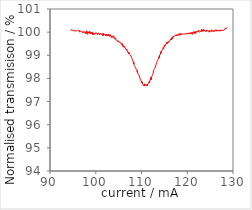
| Category | 6250ppm |
|---|---|
| 94.512 | 100.059 |
| 94.544 | 100.059 |
| 94.576 | 100.059 |
| 94.608 | 100.078 |
| 94.64 | 100.078 |
| 94.672 | 100.078 |
| 94.704 | 100.118 |
| 94.736 | 100.098 |
| 94.768 | 100.078 |
| 94.8 | 100.078 |
| 94.832 | 100.078 |
| 94.864 | 100.078 |
| 94.896 | 100.117 |
| 94.928 | 100.098 |
| 94.96 | 100.078 |
| 94.992 | 100.078 |
| 95.024 | 100.058 |
| 95.056 | 100.059 |
| 95.088 | 100.098 |
| 95.12 | 100.097 |
| 95.152 | 100.039 |
| 95.184 | 100.078 |
| 95.216 | 100.058 |
| 95.248 | 100.058 |
| 95.28 | 100.019 |
| 95.312 | 100.078 |
| 95.344 | 100.097 |
| 95.376 | 100.058 |
| 95.408 | 100.058 |
| 95.44 | 100.058 |
| 95.472 | 100.078 |
| 95.504 | 100.078 |
| 95.536 | 100.058 |
| 95.568 | 100.039 |
| 95.6 | 100.039 |
| 95.632 | 100.039 |
| 95.664 | 100.078 |
| 95.696 | 100.058 |
| 95.728 | 100.058 |
| 95.76 | 100 |
| 95.792 | 100.058 |
| 95.824 | 100.039 |
| 95.856 | 100.039 |
| 95.888 | 100.077 |
| 95.92 | 100.077 |
| 95.952 | 100.097 |
| 95.984 | 100.097 |
| 96.016 | 100.077 |
| 96.048 | 100.039 |
| 96.08 | 100.058 |
| 96.112 | 100.058 |
| 96.144 | 100.039 |
| 96.176 | 100.039 |
| 96.208 | 100.058 |
| 96.24 | 100.058 |
| 96.272 | 100.077 |
| 96.304 | 100.058 |
| 96.336 | 100.077 |
| 96.368 | 100.077 |
| 96.4 | 100.038 |
| 96.432 | 100.077 |
| 96.464 | 100.077 |
| 96.496 | 100 |
| 96.528 | 100.038 |
| 96.56 | 100.019 |
| 96.592 | 100.019 |
| 96.624 | 100.038 |
| 96.656 | 100.038 |
| 96.688 | 100.058 |
| 96.72 | 100.019 |
| 96.752 | 100.038 |
| 96.784 | 100.038 |
| 96.816 | 100.038 |
| 96.848 | 100.057 |
| 96.88 | 100.019 |
| 96.912 | 100.019 |
| 96.944 | 100 |
| 96.976 | 100.057 |
| 97.008 | 100.019 |
| 97.03999999999999 | 100 |
| 97.072 | 100.019 |
| 97.104 | 100.019 |
| 97.136 | 99.981 |
| 97.168 | 100.019 |
| 97.2 | 100.038 |
| 97.232 | 100.038 |
| 97.264 | 100 |
| 97.296 | 100.019 |
| 97.328 | 100 |
| 97.36 | 100 |
| 97.392 | 100 |
| 97.424 | 99.962 |
| 97.456 | 100 |
| 97.488 | 99.962 |
| 97.52 | 100.019 |
| 97.55199999999999 | 100 |
| 97.584 | 100.019 |
| 97.616 | 100.019 |
| 97.648 | 100 |
| 97.68 | 100 |
| 97.712 | 100.019 |
| 97.744 | 99.981 |
| 97.776 | 99.962 |
| 97.808 | 99.924 |
| 97.84 | 99.962 |
| 97.872 | 100 |
| 97.904 | 100 |
| 97.936 | 99.981 |
| 97.968 | 100 |
| 98.0 | 100.057 |
| 98.032 | 99.981 |
| 98.064 | 99.981 |
| 98.096 | 99.943 |
| 98.128 | 99.981 |
| 98.16 | 99.962 |
| 98.19200000000001 | 100 |
| 98.224 | 99.906 |
| 98.256 | 99.943 |
| 98.288 | 100.019 |
| 98.32 | 100 |
| 98.352 | 100 |
| 98.384 | 99.962 |
| 98.416 | 100 |
| 98.44800000000001 | 99.925 |
| 98.48 | 99.981 |
| 98.512 | 100 |
| 98.544 | 99.963 |
| 98.576 | 99.944 |
| 98.608 | 99.962 |
| 98.64 | 99.962 |
| 98.672 | 100.038 |
| 98.704 | 99.981 |
| 98.736 | 99.981 |
| 98.768 | 99.981 |
| 98.8 | 100.019 |
| 98.832 | 99.925 |
| 98.864 | 99.981 |
| 98.896 | 99.925 |
| 98.928 | 99.963 |
| 98.96000000000001 | 99.944 |
| 98.992 | 99.944 |
| 99.024 | 100 |
| 99.056 | 99.981 |
| 99.088 | 99.981 |
| 99.12 | 99.963 |
| 99.152 | 99.963 |
| 99.184 | 99.944 |
| 99.216 | 99.944 |
| 99.248 | 99.944 |
| 99.28 | 99.888 |
| 99.312 | 99.981 |
| 99.344 | 99.963 |
| 99.376 | 99.944 |
| 99.408 | 99.944 |
| 99.44 | 99.907 |
| 99.47200000000001 | 99.963 |
| 99.504 | 99.963 |
| 99.536 | 99.944 |
| 99.568 | 99.963 |
| 99.6 | 99.963 |
| 99.632 | 99.907 |
| 99.664 | 99.926 |
| 99.696 | 99.963 |
| 99.728 | 99.944 |
| 99.76 | 99.926 |
| 99.792 | 99.907 |
| 99.824 | 99.944 |
| 99.856 | 99.907 |
| 99.888 | 99.963 |
| 99.92 | 99.981 |
| 99.952 | 99.945 |
| 99.984 | 99.926 |
| 100.016 | 99.944 |
| 100.048 | 99.926 |
| 100.08 | 99.944 |
| 100.112 | 99.963 |
| 100.144 | 99.944 |
| 100.176 | 99.945 |
| 100.208 | 99.963 |
| 100.24 | 99.982 |
| 100.27199999999999 | 99.963 |
| 100.304 | 99.963 |
| 100.336 | 99.945 |
| 100.368 | 99.945 |
| 100.4 | 99.889 |
| 100.432 | 99.945 |
| 100.464 | 99.945 |
| 100.496 | 99.908 |
| 100.52799999999999 | 99.926 |
| 100.56 | 99.926 |
| 100.592 | 99.926 |
| 100.624 | 99.908 |
| 100.656 | 99.963 |
| 100.688 | 99.926 |
| 100.72 | 99.908 |
| 100.752 | 99.945 |
| 100.784 | 99.871 |
| 100.816 | 99.926 |
| 100.848 | 99.89 |
| 100.88 | 99.908 |
| 100.912 | 99.908 |
| 100.944 | 99.908 |
| 100.976 | 99.908 |
| 101.008 | 99.927 |
| 101.04 | 99.908 |
| 101.072 | 99.963 |
| 101.104 | 99.908 |
| 101.136 | 99.945 |
| 101.168 | 99.927 |
| 101.2 | 99.908 |
| 101.232 | 99.945 |
| 101.264 | 99.945 |
| 101.29599999999999 | 99.909 |
| 101.328 | 99.909 |
| 101.36 | 99.909 |
| 101.392 | 99.89 |
| 101.424 | 99.891 |
| 101.456 | 99.872 |
| 101.488 | 99.854 |
| 101.52 | 99.927 |
| 101.55199999999999 | 99.891 |
| 101.584 | 99.891 |
| 101.616 | 99.909 |
| 101.648 | 99.854 |
| 101.68 | 99.872 |
| 101.712 | 99.945 |
| 101.744 | 99.891 |
| 101.776 | 99.891 |
| 101.80799999999999 | 99.891 |
| 101.84 | 99.891 |
| 101.872 | 99.891 |
| 101.904 | 99.891 |
| 101.936 | 99.891 |
| 101.968 | 99.909 |
| 102.0 | 99.891 |
| 102.032 | 99.909 |
| 102.064 | 99.891 |
| 102.096 | 99.891 |
| 102.128 | 99.909 |
| 102.16 | 99.873 |
| 102.19200000000001 | 99.837 |
| 102.224 | 99.909 |
| 102.256 | 99.873 |
| 102.288 | 99.909 |
| 102.32 | 99.891 |
| 102.352 | 99.855 |
| 102.384 | 99.819 |
| 102.416 | 99.909 |
| 102.448 | 99.855 |
| 102.48 | 99.873 |
| 102.512 | 99.855 |
| 102.544 | 99.855 |
| 102.576 | 99.855 |
| 102.608 | 99.819 |
| 102.64 | 99.874 |
| 102.672 | 99.856 |
| 102.70400000000001 | 99.856 |
| 102.736 | 99.838 |
| 102.768 | 99.91 |
| 102.8 | 99.856 |
| 102.832 | 99.892 |
| 102.864 | 99.874 |
| 102.896 | 99.874 |
| 102.928 | 99.82 |
| 102.96000000000001 | 99.892 |
| 102.992 | 99.82 |
| 103.024 | 99.874 |
| 103.056 | 99.82 |
| 103.088 | 99.856 |
| 103.12 | 99.892 |
| 103.152 | 99.838 |
| 103.184 | 99.838 |
| 103.21600000000001 | 99.802 |
| 103.248 | 99.874 |
| 103.28 | 99.856 |
| 103.312 | 99.838 |
| 103.344 | 99.839 |
| 103.376 | 99.839 |
| 103.408 | 99.839 |
| 103.44 | 99.857 |
| 103.472 | 99.857 |
| 103.504 | 99.767 |
| 103.536 | 99.821 |
| 103.568 | 99.803 |
| 103.6 | 99.821 |
| 103.632 | 99.786 |
| 103.664 | 99.786 |
| 103.696 | 99.786 |
| 103.728 | 99.768 |
| 103.75999999999999 | 99.821 |
| 103.792 | 99.786 |
| 103.824 | 99.821 |
| 103.856 | 99.786 |
| 103.888 | 99.804 |
| 103.92 | 99.804 |
| 103.952 | 99.822 |
| 103.98400000000001 | 99.84 |
| 104.016 | 99.751 |
| 104.048 | 99.751 |
| 104.08 | 99.768 |
| 104.112 | 99.751 |
| 104.144 | 99.733 |
| 104.176 | 99.769 |
| 104.208 | 99.733 |
| 104.24 | 99.698 |
| 104.272 | 99.698 |
| 104.304 | 99.751 |
| 104.336 | 99.734 |
| 104.368 | 99.698 |
| 104.4 | 99.698 |
| 104.432 | 99.716 |
| 104.464 | 99.716 |
| 104.496 | 99.716 |
| 104.528 | 99.646 |
| 104.56 | 99.646 |
| 104.592 | 99.663 |
| 104.624 | 99.628 |
| 104.656 | 99.664 |
| 104.688 | 99.628 |
| 104.72 | 99.611 |
| 104.752 | 99.629 |
| 104.78399999999999 | 99.629 |
| 104.816 | 99.611 |
| 104.848 | 99.576 |
| 104.88 | 99.594 |
| 104.912 | 99.611 |
| 104.944 | 99.629 |
| 104.976 | 99.594 |
| 105.008 | 99.647 |
| 105.03999999999999 | 99.612 |
| 105.072 | 99.612 |
| 105.104 | 99.594 |
| 105.136 | 99.595 |
| 105.168 | 99.559 |
| 105.2 | 99.595 |
| 105.232 | 99.56 |
| 105.264 | 99.577 |
| 105.296 | 99.542 |
| 105.328 | 99.595 |
| 105.36 | 99.543 |
| 105.392 | 99.56 |
| 105.424 | 99.525 |
| 105.456 | 99.543 |
| 105.488 | 99.508 |
| 105.52 | 99.526 |
| 105.55199999999999 | 99.508 |
| 105.584 | 99.526 |
| 105.616 | 99.473 |
| 105.648 | 99.544 |
| 105.68 | 99.491 |
| 105.712 | 99.457 |
| 105.744 | 99.509 |
| 105.776 | 99.509 |
| 105.80799999999999 | 99.492 |
| 105.84 | 99.457 |
| 105.872 | 99.388 |
| 105.904 | 99.423 |
| 105.936 | 99.44 |
| 105.968 | 99.423 |
| 106.0 | 99.406 |
| 106.032 | 99.406 |
| 106.064 | 99.388 |
| 106.096 | 99.371 |
| 106.128 | 99.406 |
| 106.16 | 99.371 |
| 106.19200000000001 | 99.337 |
| 106.224 | 99.337 |
| 106.256 | 99.337 |
| 106.288 | 99.389 |
| 106.32 | 99.355 |
| 106.352 | 99.355 |
| 106.384 | 99.355 |
| 106.416 | 99.321 |
| 106.44800000000001 | 99.338 |
| 106.48 | 99.356 |
| 106.512 | 99.339 |
| 106.544 | 99.304 |
| 106.576 | 99.287 |
| 106.608 | 99.27 |
| 106.64 | 99.304 |
| 106.672 | 99.27 |
| 106.70400000000001 | 99.218 |
| 106.736 | 99.253 |
| 106.768 | 99.271 |
| 106.8 | 99.236 |
| 106.832 | 99.236 |
| 106.864 | 99.236 |
| 106.896 | 99.202 |
| 106.928 | 99.22 |
| 106.96000000000001 | 99.168 |
| 106.992 | 99.168 |
| 107.024 | 99.168 |
| 107.056 | 99.117 |
| 107.088 | 99.117 |
| 107.12 | 99.117 |
| 107.152 | 99.135 |
| 107.184 | 99.066 |
| 107.21600000000001 | 99.135 |
| 107.248 | 99.118 |
| 107.28 | 99.136 |
| 107.312 | 99.067 |
| 107.344 | 99.05 |
| 107.376 | 99.067 |
| 107.408 | 99.05 |
| 107.44 | 99.051 |
| 107.47200000000001 | 99.051 |
| 107.50399999999999 | 99.017 |
| 107.536 | 99.017 |
| 107.568 | 99.017 |
| 107.6 | 98.983 |
| 107.632 | 99 |
| 107.664 | 99.001 |
| 107.696 | 99.018 |
| 107.728 | 98.967 |
| 107.76 | 98.967 |
| 107.792 | 98.933 |
| 107.824 | 98.899 |
| 107.856 | 98.899 |
| 107.888 | 98.865 |
| 107.92 | 98.883 |
| 107.952 | 98.849 |
| 107.98400000000001 | 98.832 |
| 108.016 | 98.815 |
| 108.048 | 98.798 |
| 108.08 | 98.781 |
| 108.112 | 98.782 |
| 108.144 | 98.748 |
| 108.176 | 98.731 |
| 108.208 | 98.765 |
| 108.24000000000001 | 98.697 |
| 108.27199999999999 | 98.646 |
| 108.304 | 98.698 |
| 108.336 | 98.613 |
| 108.368 | 98.631 |
| 108.4 | 98.614 |
| 108.432 | 98.563 |
| 108.464 | 98.563 |
| 108.496 | 98.581 |
| 108.52799999999999 | 98.53 |
| 108.56 | 98.53 |
| 108.592 | 98.514 |
| 108.624 | 98.548 |
| 108.656 | 98.515 |
| 108.688 | 98.463 |
| 108.72 | 98.498 |
| 108.752 | 98.481 |
| 108.78399999999999 | 98.481 |
| 108.816 | 98.414 |
| 108.848 | 98.431 |
| 108.88 | 98.432 |
| 108.912 | 98.432 |
| 108.944 | 98.416 |
| 108.976 | 98.398 |
| 109.008 | 98.382 |
| 109.03999999999999 | 98.365 |
| 109.072 | 98.281 |
| 109.104 | 98.332 |
| 109.136 | 98.282 |
| 109.168 | 98.232 |
| 109.2 | 98.265 |
| 109.232 | 98.266 |
| 109.264 | 98.199 |
| 109.29599999999999 | 98.217 |
| 109.328 | 98.183 |
| 109.36 | 98.166 |
| 109.392 | 98.15 |
| 109.424 | 98.15 |
| 109.456 | 98.134 |
| 109.488 | 98.101 |
| 109.52 | 98.101 |
| 109.55199999999999 | 98.102 |
| 109.584 | 98.052 |
| 109.616 | 98.035 |
| 109.648 | 98.035 |
| 109.68 | 98.036 |
| 109.712 | 97.97 |
| 109.744 | 98.004 |
| 109.776 | 97.97 |
| 109.80799999999999 | 98.004 |
| 109.84 | 97.971 |
| 109.872 | 97.938 |
| 109.904 | 97.905 |
| 109.936 | 97.938 |
| 109.968 | 97.923 |
| 110.0 | 97.873 |
| 110.032 | 97.873 |
| 110.064 | 97.807 |
| 110.096 | 97.857 |
| 110.128 | 97.858 |
| 110.16 | 97.824 |
| 110.19200000000001 | 97.808 |
| 110.224 | 97.776 |
| 110.256 | 97.793 |
| 110.288 | 97.743 |
| 110.32 | 97.728 |
| 110.352 | 97.761 |
| 110.384 | 97.728 |
| 110.416 | 97.729 |
| 110.44800000000001 | 97.763 |
| 110.48 | 97.68 |
| 110.512 | 97.714 |
| 110.544 | 97.681 |
| 110.576 | 97.715 |
| 110.608 | 97.699 |
| 110.64 | 97.766 |
| 110.672 | 97.684 |
| 110.704 | 97.718 |
| 110.73599999999999 | 97.75 |
| 110.768 | 97.735 |
| 110.8 | 97.735 |
| 110.832 | 97.719 |
| 110.864 | 97.72 |
| 110.896 | 97.704 |
| 110.928 | 97.722 |
| 110.96000000000001 | 97.689 |
| 110.992 | 97.69 |
| 111.024 | 97.674 |
| 111.056 | 97.724 |
| 111.088 | 97.708 |
| 111.12 | 97.692 |
| 111.152 | 97.726 |
| 111.184 | 97.677 |
| 111.21600000000001 | 97.744 |
| 111.248 | 97.777 |
| 111.28 | 97.679 |
| 111.312 | 97.762 |
| 111.344 | 97.78 |
| 111.376 | 97.73 |
| 111.408 | 97.748 |
| 111.44 | 97.748 |
| 111.47200000000001 | 97.748 |
| 111.50399999999999 | 97.782 |
| 111.536 | 97.783 |
| 111.568 | 97.8 |
| 111.6 | 97.784 |
| 111.632 | 97.818 |
| 111.664 | 97.819 |
| 111.696 | 97.869 |
| 111.72800000000001 | 97.804 |
| 111.76 | 97.837 |
| 111.792 | 97.855 |
| 111.824 | 97.855 |
| 111.856 | 97.872 |
| 111.888 | 97.89 |
| 111.92 | 97.874 |
| 111.952 | 97.973 |
| 111.984 | 97.958 |
| 112.01599999999999 | 97.958 |
| 112.048 | 98.041 |
| 112.08 | 98.009 |
| 112.112 | 97.944 |
| 112.144 | 98.01 |
| 112.176 | 98.044 |
| 112.208 | 97.995 |
| 112.24000000000001 | 98.045 |
| 112.27199999999999 | 98.095 |
| 112.304 | 98.128 |
| 112.336 | 98.113 |
| 112.368 | 98.13 |
| 112.4 | 98.114 |
| 112.432 | 98.164 |
| 112.464 | 98.181 |
| 112.49600000000001 | 98.197 |
| 112.528 | 98.198 |
| 112.56 | 98.232 |
| 112.592 | 98.265 |
| 112.624 | 98.315 |
| 112.656 | 98.315 |
| 112.688 | 98.332 |
| 112.72 | 98.382 |
| 112.752 | 98.35 |
| 112.78399999999999 | 98.367 |
| 112.816 | 98.384 |
| 112.848 | 98.401 |
| 112.88 | 98.434 |
| 112.912 | 98.451 |
| 112.944 | 98.468 |
| 112.976 | 98.468 |
| 113.00800000000001 | 98.485 |
| 113.03999999999999 | 98.519 |
| 113.072 | 98.535 |
| 113.104 | 98.536 |
| 113.136 | 98.52 |
| 113.168 | 98.569 |
| 113.2 | 98.57 |
| 113.232 | 98.62 |
| 113.264 | 98.653 |
| 113.29599999999999 | 98.653 |
| 113.328 | 98.686 |
| 113.36 | 98.719 |
| 113.392 | 98.671 |
| 113.424 | 98.737 |
| 113.456 | 98.753 |
| 113.488 | 98.754 |
| 113.52 | 98.771 |
| 113.55199999999999 | 98.787 |
| 113.584 | 98.788 |
| 113.616 | 98.788 |
| 113.648 | 98.773 |
| 113.68 | 98.838 |
| 113.712 | 98.822 |
| 113.744 | 98.854 |
| 113.77600000000001 | 98.888 |
| 113.80799999999999 | 98.855 |
| 113.84 | 98.937 |
| 113.872 | 98.954 |
| 113.904 | 98.889 |
| 113.936 | 98.922 |
| 113.96799999999999 | 99.003 |
| 114.0 | 98.988 |
| 114.032 | 99.02 |
| 114.064 | 99.005 |
| 114.096 | 99.038 |
| 114.128 | 99.054 |
| 114.16 | 99.038 |
| 114.19200000000001 | 99.071 |
| 114.224 | 99.152 |
| 114.256 | 99.088 |
| 114.288 | 99.137 |
| 114.32 | 99.153 |
| 114.352 | 99.153 |
| 114.384 | 99.153 |
| 114.416 | 99.17 |
| 114.44800000000001 | 99.219 |
| 114.48 | 99.187 |
| 114.512 | 99.203 |
| 114.544 | 99.22 |
| 114.576 | 99.236 |
| 114.608 | 99.236 |
| 114.64 | 99.237 |
| 114.672 | 99.253 |
| 114.70400000000001 | 99.334 |
| 114.73599999999999 | 99.302 |
| 114.768 | 99.302 |
| 114.8 | 99.351 |
| 114.832 | 99.319 |
| 114.864 | 99.287 |
| 114.896 | 99.352 |
| 114.928 | 99.319 |
| 114.96000000000001 | 99.336 |
| 114.992 | 99.433 |
| 115.024 | 99.401 |
| 115.056 | 99.417 |
| 115.088 | 99.385 |
| 115.12 | 99.45 |
| 115.152 | 99.434 |
| 115.184 | 99.418 |
| 115.216 | 99.467 |
| 115.24799999999999 | 99.467 |
| 115.28 | 99.451 |
| 115.312 | 99.419 |
| 115.344 | 99.467 |
| 115.376 | 99.467 |
| 115.408 | 99.483 |
| 115.44 | 99.5 |
| 115.47200000000001 | 99.516 |
| 115.50399999999999 | 99.548 |
| 115.536 | 99.5 |
| 115.568 | 99.565 |
| 115.6 | 99.501 |
| 115.632 | 99.501 |
| 115.664 | 99.533 |
| 115.696 | 99.549 |
| 115.72800000000001 | 99.565 |
| 115.76 | 99.549 |
| 115.792 | 99.582 |
| 115.824 | 99.55 |
| 115.856 | 99.598 |
| 115.888 | 99.598 |
| 115.92 | 99.55 |
| 115.952 | 99.55 |
| 115.984 | 99.567 |
| 116.01599999999999 | 99.583 |
| 116.048 | 99.583 |
| 116.08 | 99.599 |
| 116.112 | 99.631 |
| 116.144 | 99.631 |
| 116.176 | 99.616 |
| 116.208 | 99.631 |
| 116.24000000000001 | 99.584 |
| 116.272 | 99.663 |
| 116.304 | 99.664 |
| 116.336 | 99.664 |
| 116.368 | 99.664 |
| 116.4 | 99.664 |
| 116.432 | 99.696 |
| 116.464 | 99.712 |
| 116.496 | 99.664 |
| 116.52799999999999 | 99.712 |
| 116.56 | 99.664 |
| 116.592 | 99.696 |
| 116.624 | 99.712 |
| 116.656 | 99.713 |
| 116.688 | 99.729 |
| 116.72 | 99.777 |
| 116.752 | 99.712 |
| 116.78399999999999 | 99.744 |
| 116.816 | 99.728 |
| 116.848 | 99.745 |
| 116.88 | 99.745 |
| 116.912 | 99.809 |
| 116.944 | 99.793 |
| 116.976 | 99.792 |
| 117.00800000000001 | 99.776 |
| 117.04 | 99.809 |
| 117.072 | 99.841 |
| 117.104 | 99.809 |
| 117.136 | 99.825 |
| 117.168 | 99.808 |
| 117.2 | 99.793 |
| 117.232 | 99.825 |
| 117.264 | 99.809 |
| 117.29599999999999 | 99.809 |
| 117.328 | 99.809 |
| 117.36 | 99.841 |
| 117.392 | 99.857 |
| 117.424 | 99.841 |
| 117.456 | 99.857 |
| 117.488 | 99.857 |
| 117.52 | 99.889 |
| 117.55199999999999 | 99.842 |
| 117.584 | 99.874 |
| 117.616 | 99.81 |
| 117.648 | 99.889 |
| 117.68 | 99.904 |
| 117.712 | 99.842 |
| 117.744 | 99.858 |
| 117.776 | 99.857 |
| 117.80799999999999 | 99.857 |
| 117.84 | 99.842 |
| 117.872 | 99.889 |
| 117.904 | 99.857 |
| 117.936 | 99.921 |
| 117.968 | 99.842 |
| 118.0 | 99.873 |
| 118.032 | 99.842 |
| 118.064 | 99.873 |
| 118.096 | 99.889 |
| 118.128 | 99.889 |
| 118.16 | 99.89 |
| 118.19200000000001 | 99.937 |
| 118.224 | 99.889 |
| 118.256 | 99.905 |
| 118.28800000000001 | 99.874 |
| 118.32 | 99.921 |
| 118.352 | 99.905 |
| 118.384 | 99.89 |
| 118.416 | 99.906 |
| 118.44800000000001 | 99.921 |
| 118.47999999999999 | 99.921 |
| 118.512 | 99.874 |
| 118.544 | 99.905 |
| 118.576 | 99.937 |
| 118.608 | 99.953 |
| 118.64 | 99.921 |
| 118.672 | 99.89 |
| 118.70400000000001 | 99.89 |
| 118.736 | 99.905 |
| 118.768 | 99.922 |
| 118.8 | 99.921 |
| 118.832 | 99.89 |
| 118.864 | 99.874 |
| 118.896 | 99.922 |
| 118.928 | 99.938 |
| 118.96000000000001 | 99.953 |
| 118.992 | 99.905 |
| 119.024 | 99.905 |
| 119.056 | 99.921 |
| 119.088 | 99.906 |
| 119.12 | 99.922 |
| 119.152 | 99.938 |
| 119.184 | 99.907 |
| 119.21600000000001 | 99.953 |
| 119.24799999999999 | 99.921 |
| 119.28 | 99.921 |
| 119.312 | 99.938 |
| 119.344 | 99.907 |
| 119.376 | 99.938 |
| 119.408 | 99.938 |
| 119.44 | 99.937 |
| 119.47200000000001 | 99.937 |
| 119.504 | 99.938 |
| 119.536 | 99.907 |
| 119.568 | 99.938 |
| 119.6 | 99.953 |
| 119.632 | 99.921 |
| 119.664 | 99.921 |
| 119.696 | 99.952 |
| 119.728 | 99.937 |
| 119.75999999999999 | 99.938 |
| 119.792 | 99.953 |
| 119.824 | 99.954 |
| 119.856 | 99.938 |
| 119.888 | 99.922 |
| 119.92 | 99.906 |
| 119.952 | 99.954 |
| 119.98400000000001 | 99.954 |
| 120.01599999999999 | 99.938 |
| 120.048 | 99.969 |
| 120.08 | 99.969 |
| 120.112 | 99.922 |
| 120.144 | 99.969 |
| 120.176 | 99.923 |
| 120.208 | 99.938 |
| 120.24000000000001 | 99.969 |
| 120.272 | 99.953 |
| 120.304 | 99.937 |
| 120.336 | 99.954 |
| 120.368 | 99.985 |
| 120.4 | 99.938 |
| 120.432 | 99.954 |
| 120.464 | 99.922 |
| 120.496 | 99.922 |
| 120.52799999999999 | 99.923 |
| 120.56 | 99.969 |
| 120.592 | 99.938 |
| 120.624 | 99.938 |
| 120.656 | 99.954 |
| 120.688 | 99.937 |
| 120.72 | 99.953 |
| 120.75200000000001 | 99.937 |
| 120.78399999999999 | 99.969 |
| 120.816 | 99.923 |
| 120.848 | 99.969 |
| 120.88 | 99.922 |
| 120.912 | 99.938 |
| 120.944 | 99.922 |
| 120.976 | 99.954 |
| 121.008 | 99.954 |
| 121.03999999999999 | 99.985 |
| 121.072 | 99.954 |
| 121.104 | 99.969 |
| 121.136 | 99.907 |
| 121.168 | 99.985 |
| 121.2 | 99.969 |
| 121.232 | 99.969 |
| 121.264 | 100 |
| 121.29599999999999 | 99.954 |
| 121.328 | 99.968 |
| 121.36 | 99.985 |
| 121.392 | 100.015 |
| 121.424 | 100.015 |
| 121.456 | 100 |
| 121.488 | 99.954 |
| 121.52000000000001 | 99.954 |
| 121.55199999999999 | 100 |
| 121.584 | 99.923 |
| 121.616 | 99.924 |
| 121.648 | 99.985 |
| 121.68 | 99.939 |
| 121.71199999999999 | 100.031 |
| 121.744 | 100 |
| 121.776 | 100 |
| 121.80799999999999 | 100.015 |
| 121.84 | 99.985 |
| 121.872 | 100 |
| 121.904 | 100.015 |
| 121.936 | 99.985 |
| 121.968 | 99.985 |
| 122.0 | 100.016 |
| 122.032 | 100.03 |
| 122.064 | 99.985 |
| 122.096 | 100.015 |
| 122.128 | 100.015 |
| 122.16 | 100.03 |
| 122.19200000000001 | 100.031 |
| 122.22399999999999 | 100.047 |
| 122.256 | 100.03 |
| 122.28800000000001 | 100.03 |
| 122.32 | 100.03 |
| 122.352 | 100.046 |
| 122.384 | 100.046 |
| 122.416 | 100.062 |
| 122.44800000000001 | 100.046 |
| 122.48 | 100.091 |
| 122.512 | 100.03 |
| 122.544 | 100.061 |
| 122.576 | 100.046 |
| 122.608 | 100.046 |
| 122.64 | 100.03 |
| 122.672 | 100.061 |
| 122.70400000000001 | 100.015 |
| 122.736 | 100 |
| 122.768 | 100.03 |
| 122.8 | 100.031 |
| 122.832 | 100.031 |
| 122.864 | 100.03 |
| 122.896 | 100.045 |
| 122.928 | 100.03 |
| 122.96000000000001 | 100.015 |
| 122.99199999999999 | 100.03 |
| 123.024 | 100.061 |
| 123.056 | 100.016 |
| 123.088 | 100.077 |
| 123.12 | 100.03 |
| 123.152 | 100.015 |
| 123.184 | 100.122 |
| 123.21600000000001 | 100.03 |
| 123.248 | 100.061 |
| 123.28 | 100.061 |
| 123.312 | 100.03 |
| 123.344 | 100.03 |
| 123.376 | 100.045 |
| 123.408 | 100.091 |
| 123.44 | 100.061 |
| 123.47200000000001 | 100.076 |
| 123.50399999999999 | 100.045 |
| 123.536 | 100.09 |
| 123.568 | 100.045 |
| 123.6 | 100.106 |
| 123.632 | 100.061 |
| 123.664 | 100.046 |
| 123.696 | 100.091 |
| 123.728 | 100.075 |
| 123.75999999999999 | 100.045 |
| 123.792 | 100.075 |
| 123.824 | 100.09 |
| 123.856 | 100.076 |
| 123.888 | 100.061 |
| 123.92 | 100.046 |
| 123.952 | 100.045 |
| 123.98400000000001 | 100.03 |
| 124.016 | 100.03 |
| 124.048 | 100.06 |
| 124.08 | 100.03 |
| 124.112 | 100.045 |
| 124.144 | 100.075 |
| 124.176 | 100.09 |
| 124.208 | 100.075 |
| 124.24000000000001 | 100.03 |
| 124.27199999999999 | 100.091 |
| 124.304 | 100.061 |
| 124.336 | 100.091 |
| 124.368 | 100.06 |
| 124.4 | 100.075 |
| 124.432 | 100.075 |
| 124.464 | 100.076 |
| 124.49600000000001 | 100.076 |
| 124.52799999999999 | 100.076 |
| 124.56 | 100.06 |
| 124.592 | 100.045 |
| 124.624 | 100.045 |
| 124.656 | 100.091 |
| 124.688 | 100.061 |
| 124.72 | 100.046 |
| 124.75200000000001 | 100.045 |
| 124.78399999999999 | 100.06 |
| 124.816 | 100 |
| 124.848 | 100.06 |
| 124.88 | 100.03 |
| 124.912 | 100.046 |
| 124.944 | 100.06 |
| 124.976 | 100.045 |
| 125.008 | 100.045 |
| 125.03999999999999 | 100.06 |
| 125.072 | 100.06 |
| 125.104 | 100.06 |
| 125.136 | 100.031 |
| 125.168 | 100.046 |
| 125.2 | 100.061 |
| 125.232 | 100.06 |
| 125.26400000000001 | 100.015 |
| 125.29599999999999 | 100.06 |
| 125.328 | 100.06 |
| 125.36 | 100.09 |
| 125.392 | 100.105 |
| 125.424 | 100.074 |
| 125.45599999999999 | 100.074 |
| 125.488 | 100.059 |
| 125.52000000000001 | 100.03 |
| 125.55199999999999 | 100.046 |
| 125.584 | 100.06 |
| 125.616 | 100.075 |
| 125.648 | 100.03 |
| 125.68 | 100.015 |
| 125.712 | 100.03 |
| 125.744 | 100.075 |
| 125.776 | 100.075 |
| 125.80799999999999 | 100.06 |
| 125.84 | 100.059 |
| 125.872 | 100.059 |
| 125.904 | 100.059 |
| 125.936 | 100.03 |
| 125.968 | 100.044 |
| 126.0 | 100.075 |
| 126.03200000000001 | 100.104 |
| 126.064 | 100.074 |
| 126.096 | 100.059 |
| 126.128 | 100.044 |
| 126.16 | 100.044 |
| 126.19200000000001 | 100.059 |
| 126.22399999999999 | 100.06 |
| 126.256 | 100.059 |
| 126.288 | 100.103 |
| 126.32 | 100.089 |
| 126.352 | 100.044 |
| 126.384 | 100.044 |
| 126.416 | 100.075 |
| 126.44800000000001 | 100.059 |
| 126.48 | 100.089 |
| 126.512 | 100.044 |
| 126.544 | 100.059 |
| 126.576 | 100.089 |
| 126.608 | 100.075 |
| 126.64 | 100.059 |
| 126.672 | 100.104 |
| 126.70400000000001 | 100.059 |
| 126.73599999999999 | 100.059 |
| 126.768 | 100.059 |
| 126.80000000000001 | 100.045 |
| 126.832 | 100.03 |
| 126.864 | 100.06 |
| 126.896 | 100.089 |
| 126.928 | 100.074 |
| 126.96000000000001 | 100.074 |
| 126.99199999999999 | 100.089 |
| 127.024 | 100.06 |
| 127.056 | 100.045 |
| 127.088 | 100.089 |
| 127.12 | 100.088 |
| 127.152 | 100.044 |
| 127.184 | 100.073 |
| 127.21600000000001 | 100.059 |
| 127.248 | 100.074 |
| 127.28 | 100.045 |
| 127.312 | 100.074 |
| 127.344 | 100.103 |
| 127.376 | 100.073 |
| 127.408 | 100.088 |
| 127.44 | 100.089 |
| 127.47200000000001 | 100.074 |
| 127.50399999999999 | 100.06 |
| 127.536 | 100.059 |
| 127.568 | 100.059 |
| 127.6 | 100.044 |
| 127.632 | 100.073 |
| 127.664 | 100.059 |
| 127.696 | 100.074 |
| 127.72800000000001 | 100.089 |
| 127.75999999999999 | 100.089 |
| 127.792 | 100.102 |
| 127.824 | 100.088 |
| 127.856 | 100.058 |
| 127.888 | 100.089 |
| 127.92 | 100.103 |
| 127.952 | 100.089 |
| 127.98400000000001 | 100.074 |
| 128.016 | 100.073 |
| 128.048 | 100.102 |
| 128.07999999999998 | 100.088 |
| 128.112 | 100.088 |
| 128.144 | 100.088 |
| 128.176 | 100.132 |
| 128.208 | 100.118 |
| 128.24 | 100.117 |
| 128.272 | 100.102 |
| 128.304 | 100.118 |
| 128.336 | 100.147 |
| 128.368 | 100.176 |
| 128.4 | 100.161 |
| 128.43200000000002 | 100.132 |
| 128.464 | 100.161 |
| 128.496 | 100.176 |
| 128.528 | 100.146 |
| 128.56 | 100.176 |
| 128.59199999999998 | 100.176 |
| 128.624 | 100.19 |
| 128.656 | 100.161 |
| 128.688 | 100.146 |
| 128.72 | 100.191 |
| 128.752 | 100.205 |
| 128.784 | 100.175 |
| 128.816 | 100.161 |
| 128.848 | 100.219 |
| 128.88 | 100.219 |
| 128.912 | 100.219 |